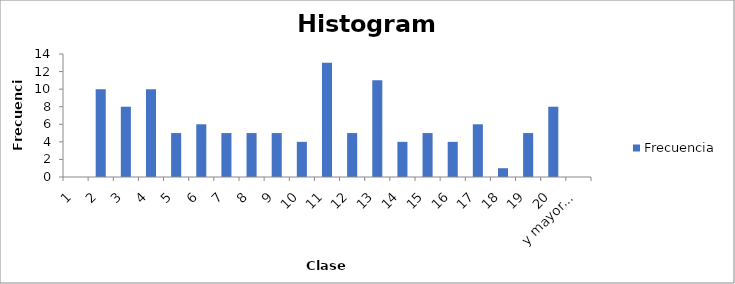
| Category | Frecuencia |
|---|---|
| 1 | 0 |
| 2 | 10 |
| 3 | 8 |
| 4 | 10 |
| 5 | 5 |
| 6 | 6 |
| 7 | 5 |
| 8 | 5 |
| 9 | 5 |
| 10 | 4 |
| 11 | 13 |
| 12 | 5 |
| 13 | 11 |
| 14 | 4 |
| 15 | 5 |
| 16 | 4 |
| 17 | 6 |
| 18 | 1 |
| 19 | 5 |
| 20 | 8 |
| y mayor... | 0 |